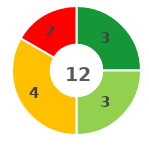
| Category | Series 0 |
|---|---|
| 0 | 3 |
| 1 | 3 |
| 2 | 4 |
| 3 | 2 |
| 4 | 0 |